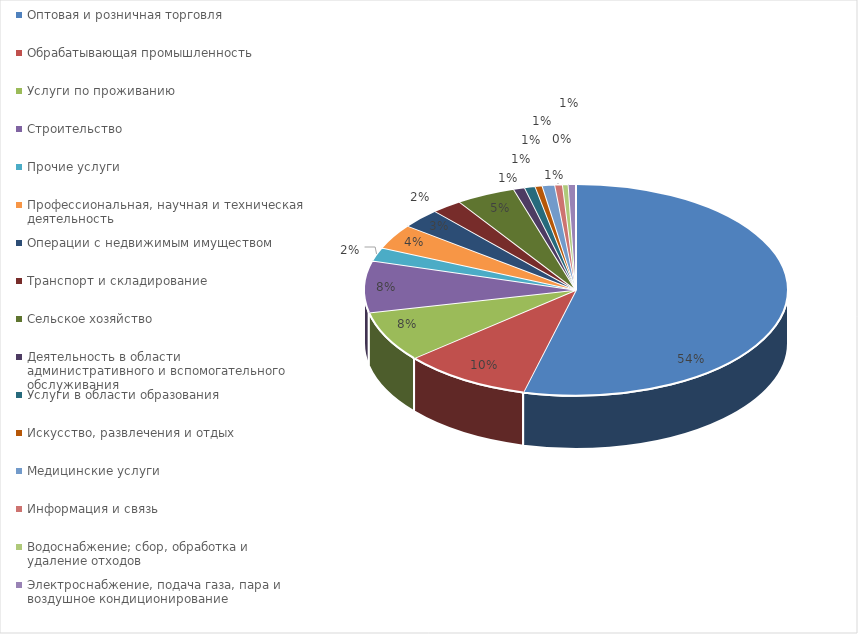
| Category | Series 0 |
|---|---|
| Оптовая и розничная торговля | 0.54 |
| Обрабатывающая промышленность | 0.098 |
| Услуги по проживанию | 0.077 |
| Строительство | 0.079 |
| Прочие услуги | 0.021 |
| Профессиональная, научная и техническая деятельность | 0.038 |
| Операции с недвижимым имуществом | 0.03 |
| Транспорт и складирование | 0.023 |
| Сельское хозяйство | 0.045 |
| Деятельность в области административного и вспомогательного обслуживания | 0.009 |
| Услуги в области образования | 0.008 |
| Искусство, развлечения и отдых | 0.005 |
| Медицинские услуги | 0.01 |
| Информация и связь | 0.006 |
| Водоснабжение; сбор, обработка и удаление отходов | 0.004 |
| Электроснабжение, подача газа, пара и воздушное кондиционирование | 0.006 |